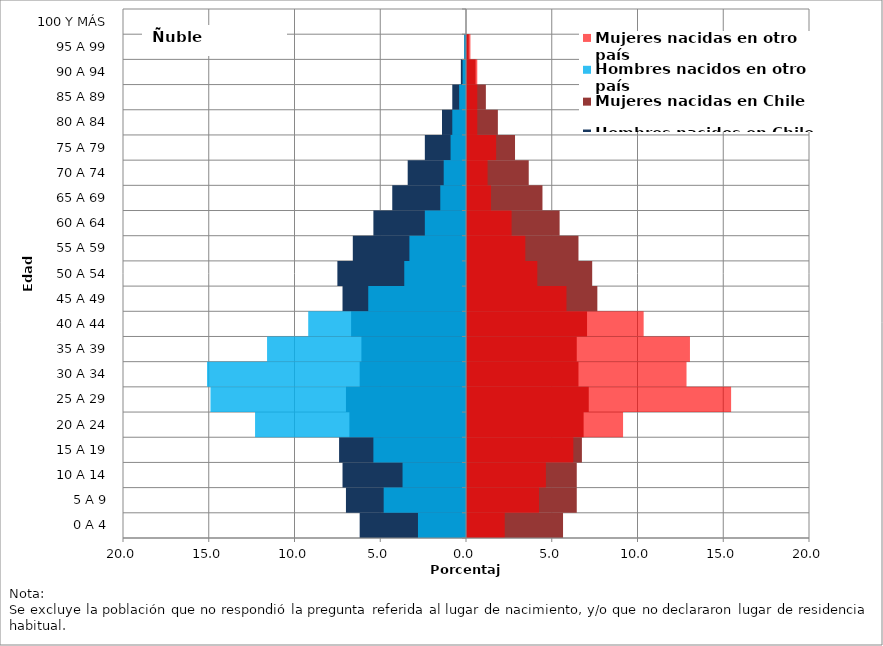
| Category | Hombres nacidos en Chile | Mujeres nacidas en Chile | Hombres nacidos en otro país | Mujeres nacidas en otro país |
|---|---|---|---|---|
| 0 A 4 | -6.2 | 5.6 | -2.8 | 2.2 |
| 5 A 9 | -7 | 6.4 | -4.8 | 4.2 |
| 10 A 14 | -7.2 | 6.4 | -3.7 | 4.6 |
| 15 A 19 | -7.4 | 6.7 | -5.4 | 6.2 |
| 20 A 24 | -6.8 | 6.8 | -12.3 | 9.1 |
| 25 A 29 | -7 | 7.1 | -14.9 | 15.4 |
| 30 A 34 | -6.2 | 6.5 | -15.1 | 12.8 |
| 35 A 39 | -6.1 | 6.4 | -11.6 | 13 |
| 40 A 44 | -6.7 | 7 | -9.2 | 10.3 |
| 45 A 49 | -7.2 | 7.6 | -5.7 | 5.8 |
| 50 A 54 | -7.5 | 7.3 | -3.6 | 4.1 |
| 55 A 59 | -6.6 | 6.5 | -3.3 | 3.4 |
| 60 A 64 | -5.4 | 5.4 | -2.4 | 2.6 |
| 65 A 69 | -4.3 | 4.4 | -1.5 | 1.4 |
| 70 A 74 | -3.4 | 3.6 | -1.3 | 1.2 |
| 75 A 79 | -2.4 | 2.8 | -0.9 | 1.7 |
| 80 A 84 | -1.4 | 1.8 | -0.8 | 0.6 |
| 85 A 89 | -0.8 | 1.1 | -0.4 | 0.6 |
| 90 A 94 | -0.3 | 0.5 | -0.2 | 0.6 |
| 95 A 99 | -0.1 | 0.1 | -0.1 | 0.2 |
| 100 Y MÁS | 0 | 0 | 0 | 0 |